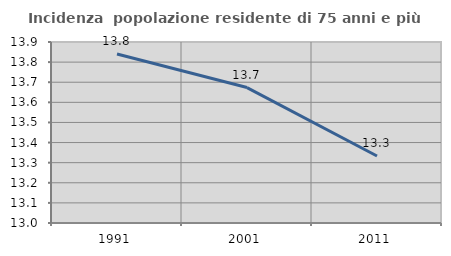
| Category | Incidenza  popolazione residente di 75 anni e più |
|---|---|
| 1991.0 | 13.84 |
| 2001.0 | 13.673 |
| 2011.0 | 13.333 |